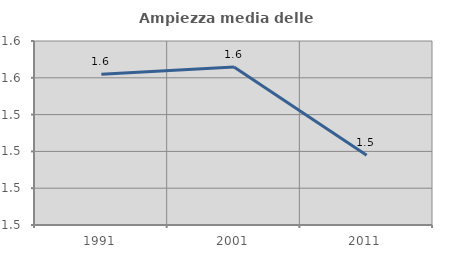
| Category | Ampiezza media delle famiglie |
|---|---|
| 1991.0 | 1.562 |
| 2001.0 | 1.566 |
| 2011.0 | 1.518 |